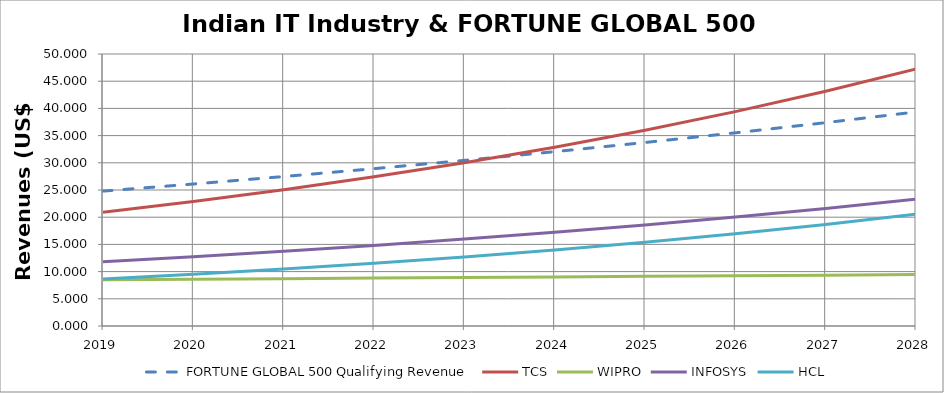
| Category | FORTUNE GLOBAL 500 Qualifying Revenue | TCS | WIPRO | INFOSYS | HCL |
|---|---|---|---|---|---|
| 2019.0 | 24.796 | 20.9 | 8.5 | 11.799 | 8.632 |
| 2020.0 | 26.101 | 22.882 | 8.601 | 12.727 | 9.506 |
| 2021.0 | 27.475 | 25.051 | 8.704 | 13.727 | 10.469 |
| 2022.0 | 28.922 | 27.426 | 8.807 | 14.806 | 11.53 |
| 2023.0 | 30.444 | 30.027 | 8.912 | 15.97 | 12.698 |
| 2024.0 | 32.047 | 32.874 | 9.018 | 17.226 | 13.984 |
| 2025.0 | 33.734 | 35.991 | 9.126 | 18.58 | 15.401 |
| 2026.0 | 35.509 | 39.403 | 9.234 | 20.041 | 16.961 |
| 2027.0 | 37.379 | 43.139 | 9.344 | 21.617 | 18.679 |
| 2028.0 | 39.346 | 47.229 | 9.455 | 23.316 | 20.572 |